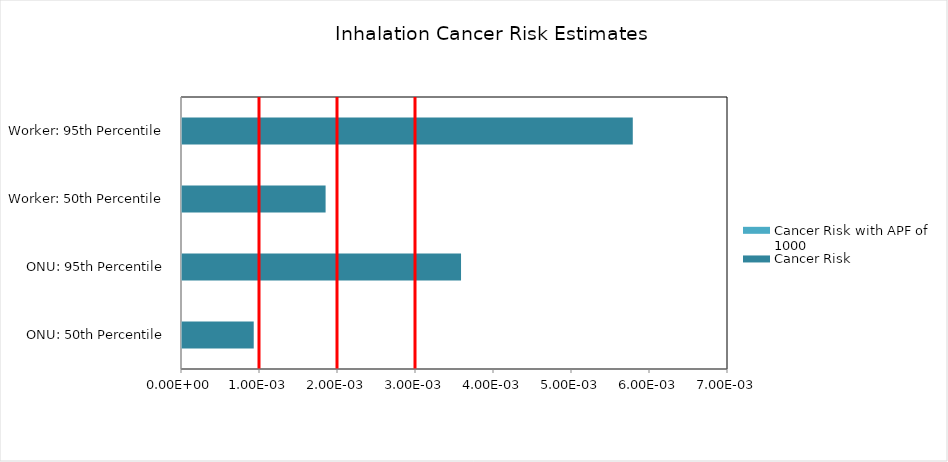
| Category | Cancer Risk with APF of 1000 | Cancer Risk |
|---|---|---|
| ONU: 50th Percentile | 0 | 0.001 |
| ONU: 95th Percentile | 0 | 0.004 |
| Worker: 50th Percentile | 0 | 0.002 |
| Worker: 95th Percentile | 0 | 0.006 |